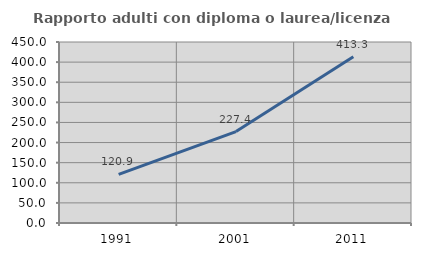
| Category | Rapporto adulti con diploma o laurea/licenza media  |
|---|---|
| 1991.0 | 120.94 |
| 2001.0 | 227.389 |
| 2011.0 | 413.258 |